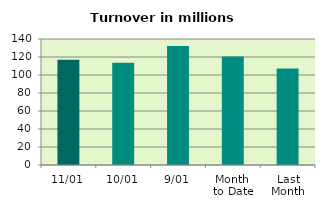
| Category | Series 0 |
|---|---|
| 11/01 | 116.93 |
| 10/01 | 113.662 |
| 9/01 | 132.188 |
| Month 
to Date | 120.609 |
| Last
Month | 107.094 |